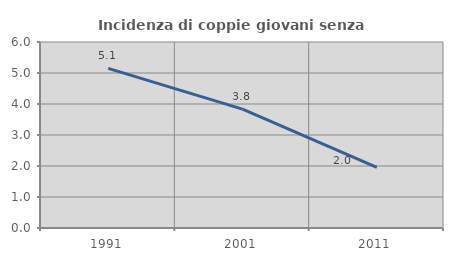
| Category | Incidenza di coppie giovani senza figli |
|---|---|
| 1991.0 | 5.15 |
| 2001.0 | 3.836 |
| 2011.0 | 1.952 |